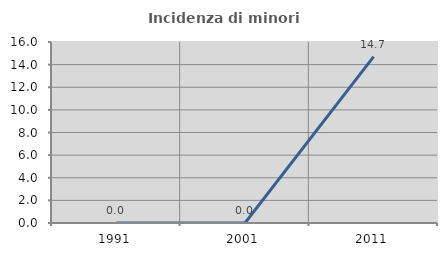
| Category | Incidenza di minori stranieri |
|---|---|
| 1991.0 | 0 |
| 2001.0 | 0 |
| 2011.0 | 14.706 |